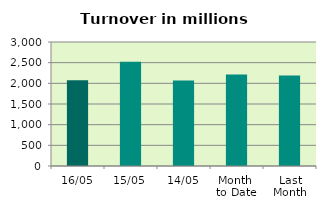
| Category | Series 0 |
|---|---|
| 16/05 | 2071.596 |
| 15/05 | 2523.947 |
| 14/05 | 2067.038 |
| Month 
to Date | 2212.883 |
| Last
Month | 2186.926 |